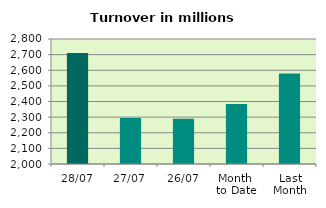
| Category | Series 0 |
|---|---|
| 28/07 | 2710.919 |
| 27/07 | 2294.122 |
| 26/07 | 2289.19 |
| Month 
to Date | 2384.261 |
| Last
Month | 2579.746 |